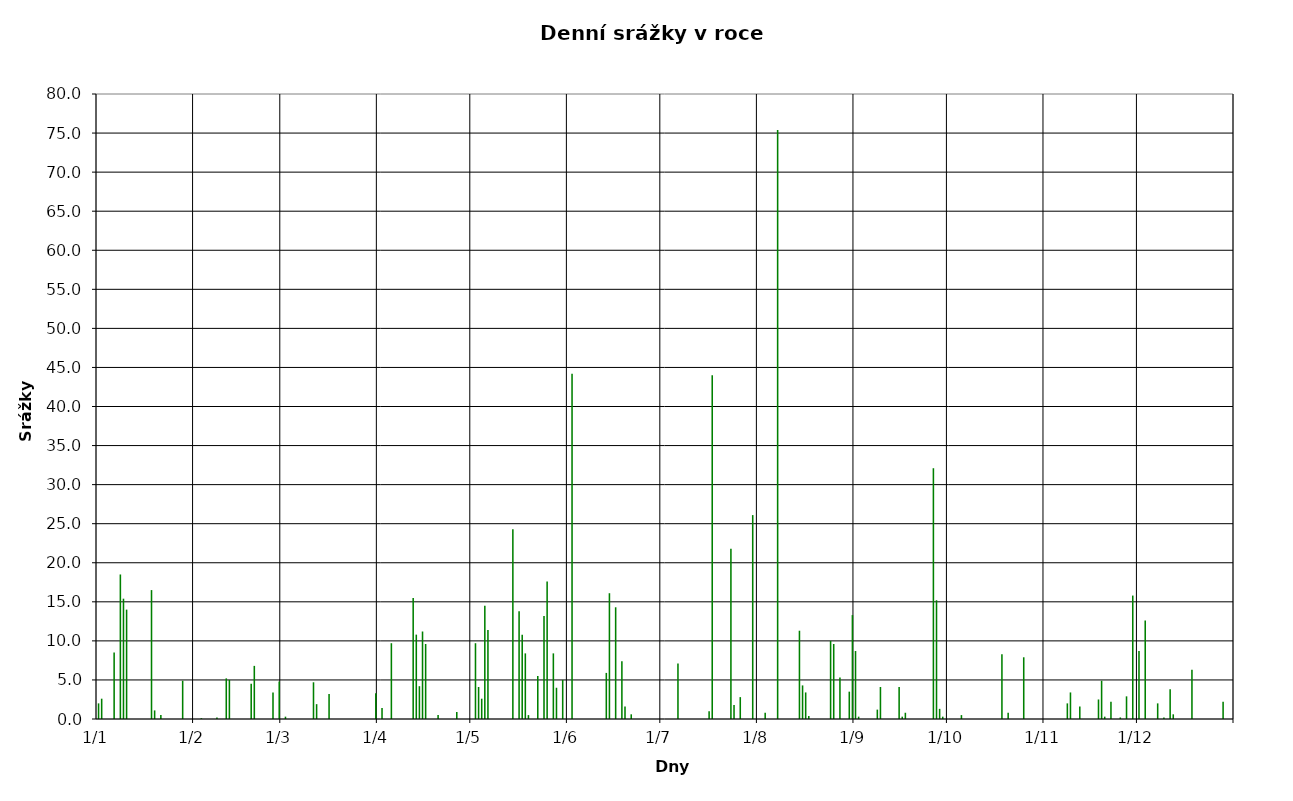
| Category | Series 0 |
|---|---|
| 2010-01-01 | 2 |
| 2010-01-02 | 2.6 |
| 2010-01-03 | 0 |
| 2010-01-04 | 0 |
| 2010-01-05 | 0 |
| 2010-01-06 | 8.5 |
| 2010-01-07 | 0 |
| 2010-01-08 | 18.5 |
| 2010-01-09 | 15.4 |
| 2010-01-10 | 14 |
| 2010-01-11 | 0 |
| 2010-01-12 | 0 |
| 2010-01-13 | 0 |
| 2010-01-14 | 0 |
| 2010-01-15 | 0 |
| 2010-01-16 | 0 |
| 2010-01-17 | 0 |
| 2010-01-18 | 16.5 |
| 2010-01-19 | 1.1 |
| 2010-01-20 | 0 |
| 2010-01-21 | 0.5 |
| 2010-01-22 | 0 |
| 2010-01-23 | 0 |
| 2010-01-24 | 0 |
| 2010-01-25 | 0 |
| 2010-01-26 | 0 |
| 2010-01-27 | 0 |
| 2010-01-28 | 4.9 |
| 2010-01-29 | 0 |
| 2010-01-30 | 0 |
| 2010-01-31 | 0 |
| 2010-02-01 | 0 |
| 2010-02-02 | 0 |
| 2010-02-03 | 0.1 |
| 2010-02-04 | 0 |
| 2010-02-05 | 0 |
| 2010-02-06 | 0 |
| 2010-02-07 | 0 |
| 2010-02-08 | 0.2 |
| 2010-02-09 | 0 |
| 2010-02-10 | 0 |
| 2010-02-11 | 5.2 |
| 2010-02-12 | 5 |
| 2010-02-13 | 0 |
| 2010-02-14 | 0 |
| 2010-02-15 | 0 |
| 2010-02-16 | 0 |
| 2010-02-17 | 0 |
| 2010-02-18 | 0 |
| 2010-02-19 | 4.5 |
| 2010-02-20 | 6.8 |
| 2010-02-21 | 0 |
| 2010-02-22 | 0 |
| 2010-02-23 | 0 |
| 2010-02-24 | 0 |
| 2010-02-25 | 0 |
| 2010-02-26 | 3.4 |
| 2010-02-27 | 0 |
| 2010-02-28 | 4.8 |
| 2010-03-01 | 0 |
| 2010-03-02 | 0.3 |
| 2010-03-03 | 0 |
| 2010-03-04 | 0 |
| 2010-03-05 | 0 |
| 2010-03-06 | 0 |
| 2010-03-07 | 0 |
| 2010-03-08 | 0 |
| 2010-03-09 | 0 |
| 2010-03-10 | 0 |
| 2010-03-11 | 4.7 |
| 2010-03-12 | 1.9 |
| 2010-03-13 | 0 |
| 2010-03-14 | 0 |
| 2010-03-15 | 0 |
| 2010-03-16 | 3.2 |
| 2010-03-17 | 0 |
| 2010-03-18 | 0 |
| 2010-03-19 | 0 |
| 2010-03-20 | 0 |
| 2010-03-21 | 0 |
| 2010-03-22 | 0 |
| 2010-03-23 | 0 |
| 2010-03-24 | 0 |
| 2010-03-25 | 0 |
| 2010-03-26 | 0 |
| 2010-03-27 | 0 |
| 2010-03-28 | 0 |
| 2010-03-29 | 0 |
| 2010-03-30 | 0 |
| 2010-03-31 | 3.3 |
| 2010-04-01 | 0 |
| 2010-04-02 | 1.4 |
| 2010-04-03 | 0 |
| 2010-04-04 | 0 |
| 2010-04-05 | 9.7 |
| 2010-04-06 | 0 |
| 2010-04-07 | 0 |
| 2010-04-08 | 0 |
| 2010-04-09 | 0 |
| 2010-04-10 | 0 |
| 2010-04-11 | 0 |
| 2010-04-12 | 15.5 |
| 2010-04-13 | 10.8 |
| 2010-04-14 | 4.2 |
| 2010-04-15 | 11.2 |
| 2010-04-16 | 9.6 |
| 2010-04-17 | 0 |
| 2010-04-18 | 0 |
| 2010-04-19 | 0 |
| 2010-04-20 | 0.5 |
| 2010-04-21 | 0 |
| 2010-04-22 | 0 |
| 2010-04-23 | 0 |
| 2010-04-24 | 0 |
| 2010-04-25 | 0 |
| 2010-04-26 | 0.9 |
| 2010-04-27 | 0 |
| 2010-04-28 | 0 |
| 2010-04-29 | 0 |
| 2010-04-30 | 0 |
| 2010-05-01 | 0 |
| 2010-05-02 | 9.7 |
| 2010-05-03 | 4.1 |
| 2010-05-04 | 2.6 |
| 2010-05-05 | 14.5 |
| 2010-05-06 | 11.4 |
| 2010-05-07 | 0 |
| 2010-05-08 | 0 |
| 2010-05-09 | 0 |
| 2010-05-10 | 0 |
| 2010-05-11 | 0 |
| 2010-05-12 | 0 |
| 2010-05-13 | 0 |
| 2010-05-14 | 24.3 |
| 2010-05-15 | 0 |
| 2010-05-16 | 13.8 |
| 2010-05-17 | 10.8 |
| 2010-05-18 | 8.4 |
| 2010-05-19 | 0.5 |
| 2010-05-20 | 0 |
| 2010-05-21 | 0 |
| 2010-05-22 | 5.5 |
| 2010-05-23 | 0 |
| 2010-05-24 | 13.2 |
| 2010-05-25 | 17.6 |
| 2010-05-26 | 0 |
| 2010-05-27 | 8.4 |
| 2010-05-28 | 4 |
| 2010-05-29 | 0 |
| 2010-05-30 | 5 |
| 2010-05-31 | 0 |
| 2010-06-01 | 0 |
| 2010-06-02 | 44.2 |
| 2010-06-03 | 0 |
| 2010-06-04 | 0 |
| 2010-06-05 | 0 |
| 2010-06-06 | 0 |
| 2010-06-07 | 0 |
| 2010-06-08 | 0 |
| 2010-06-09 | 0 |
| 2010-06-10 | 0 |
| 2010-06-11 | 0 |
| 2010-06-12 | 0 |
| 2010-06-13 | 5.9 |
| 2010-06-14 | 16.1 |
| 2010-06-15 | 0 |
| 2010-06-16 | 14.3 |
| 2010-06-17 | 0 |
| 2010-06-18 | 7.4 |
| 2010-06-19 | 1.6 |
| 2010-06-20 | 0 |
| 2010-06-21 | 0.6 |
| 2010-06-22 | 0 |
| 2010-06-23 | 0 |
| 2010-06-24 | 0 |
| 2010-06-25 | 0 |
| 2010-06-26 | 0 |
| 2010-06-27 | 0 |
| 2010-06-28 | 0 |
| 2010-06-29 | 0 |
| 2010-06-30 | 0 |
| 2010-07-01 | 0 |
| 2010-07-02 | 0 |
| 2010-07-03 | 0 |
| 2010-07-04 | 0 |
| 2010-07-05 | 0 |
| 2010-07-06 | 7.1 |
| 2010-07-07 | 0 |
| 2010-07-08 | 0 |
| 2010-07-09 | 0 |
| 2010-07-10 | 0 |
| 2010-07-11 | 0 |
| 2010-07-12 | 0 |
| 2010-07-13 | 0 |
| 2010-07-14 | 0 |
| 2010-07-15 | 0 |
| 2010-07-16 | 1 |
| 2010-07-17 | 44 |
| 2010-07-18 | 0 |
| 2010-07-19 | 0 |
| 2010-07-20 | 0 |
| 2010-07-21 | 0 |
| 2010-07-22 | 0 |
| 2010-07-23 | 21.8 |
| 2010-07-24 | 1.8 |
| 2010-07-25 | 0 |
| 2010-07-26 | 2.8 |
| 2010-07-27 | 0 |
| 2010-07-28 | 0 |
| 2010-07-29 | 0 |
| 2010-07-30 | 26.1 |
| 2010-07-31 | 0 |
| 2010-08-01 | 0 |
| 2010-08-02 | 0 |
| 2010-08-03 | 0.8 |
| 2010-08-04 | 0 |
| 2010-08-05 | 0 |
| 2010-08-06 | 0 |
| 2010-08-07 | 75.4 |
| 2010-08-08 | 0 |
| 2010-08-09 | 0 |
| 2010-08-10 | 0 |
| 2010-08-11 | 0 |
| 2010-08-12 | 0 |
| 2010-08-13 | 0 |
| 2010-08-14 | 11.3 |
| 2010-08-15 | 4.3 |
| 2010-08-16 | 3.4 |
| 2010-08-17 | 0.4 |
| 2010-08-18 | 0 |
| 2010-08-19 | 0 |
| 2010-08-20 | 0 |
| 2010-08-21 | 0 |
| 2010-08-22 | 0 |
| 2010-08-23 | 0 |
| 2010-08-24 | 10 |
| 2010-08-25 | 9.6 |
| 2010-08-26 | 0 |
| 2010-08-27 | 5.3 |
| 2010-08-28 | 0 |
| 2010-08-29 | 0 |
| 2010-08-30 | 3.5 |
| 2010-08-31 | 13.3 |
| 2010-09-01 | 8.7 |
| 2010-09-02 | 0.3 |
| 2010-09-03 | 0 |
| 2010-09-04 | 0 |
| 2010-09-05 | 0 |
| 2010-09-06 | 0 |
| 2010-09-07 | 0 |
| 2010-09-08 | 1.2 |
| 2010-09-09 | 4.1 |
| 2010-09-10 | 0 |
| 2010-09-11 | 0 |
| 2010-09-12 | 0 |
| 2010-09-13 | 0 |
| 2010-09-14 | 0 |
| 2010-09-15 | 4.1 |
| 2010-09-16 | 0.3 |
| 2010-09-17 | 0.8 |
| 2010-09-18 | 0 |
| 2010-09-19 | 0 |
| 2010-09-20 | 0 |
| 2010-09-21 | 0 |
| 2010-09-22 | 0 |
| 2010-09-23 | 0 |
| 2010-09-24 | 0 |
| 2010-09-25 | 0 |
| 2010-09-26 | 32.1 |
| 2010-09-27 | 15.2 |
| 2010-09-28 | 1.3 |
| 2010-09-29 | 0.3 |
| 2010-09-30 | 0 |
| 2010-10-01 | 0 |
| 2010-10-02 | 0 |
| 2010-10-03 | 0 |
| 2010-10-04 | 0 |
| 2010-10-05 | 0.5 |
| 2010-10-06 | 0 |
| 2010-10-07 | 0 |
| 2010-10-08 | 0 |
| 2010-10-09 | 0 |
| 2010-10-10 | 0 |
| 2010-10-11 | 0 |
| 2010-10-12 | 0 |
| 2010-10-13 | 0 |
| 2010-10-14 | 0 |
| 2010-10-15 | 0 |
| 2010-10-16 | 0 |
| 2010-10-17 | 0 |
| 2010-10-18 | 8.3 |
| 2010-10-19 | 0 |
| 2010-10-20 | 0.8 |
| 2010-10-21 | 0 |
| 2010-10-22 | 0 |
| 2010-10-23 | 0 |
| 2010-10-24 | 0 |
| 2010-10-25 | 7.9 |
| 2010-10-26 | 0 |
| 2010-10-27 | 0 |
| 2010-10-28 | 0 |
| 2010-10-29 | 0 |
| 2010-10-30 | 0 |
| 2010-10-31 | 0 |
| 2010-11-01 | 0 |
| 2010-11-02 | 0 |
| 2010-11-03 | 0 |
| 2010-11-04 | 0 |
| 2010-11-05 | 0 |
| 2010-11-06 | 0 |
| 2010-11-07 | 0 |
| 2010-11-08 | 2 |
| 2010-11-09 | 3.4 |
| 2010-11-10 | 0 |
| 2010-11-11 | 0 |
| 2010-11-12 | 1.6 |
| 2010-11-13 | 0 |
| 2010-11-14 | 0 |
| 2010-11-15 | 0 |
| 2010-11-16 | 0 |
| 2010-11-17 | 0 |
| 2010-11-18 | 2.5 |
| 2010-11-19 | 4.9 |
| 2010-11-20 | 0.3 |
| 2010-11-21 | 0 |
| 2010-11-22 | 2.2 |
| 2010-11-23 | 0 |
| 2010-11-24 | 0 |
| 2010-11-25 | 0.2 |
| 2010-11-26 | 0 |
| 2010-11-27 | 2.9 |
| 2010-11-28 | 0 |
| 2010-11-29 | 15.8 |
| 2010-11-30 | 0 |
| 2010-12-01 | 8.7 |
| 2010-12-02 | 0 |
| 2010-12-03 | 12.6 |
| 2010-12-04 | 0 |
| 2010-12-05 | 0 |
| 2010-12-06 | 0 |
| 2010-12-07 | 2 |
| 2010-12-08 | 0 |
| 2010-12-09 | 0.2 |
| 2010-12-10 | 0 |
| 2010-12-11 | 3.8 |
| 2010-12-12 | 0.6 |
| 2010-12-13 | 0 |
| 2010-12-14 | 0 |
| 2010-12-15 | 0 |
| 2010-12-16 | 0 |
| 2010-12-17 | 0 |
| 2010-12-18 | 6.3 |
| 2010-12-19 | 0 |
| 2010-12-20 | 0 |
| 2010-12-21 | 0 |
| 2010-12-22 | 0 |
| 2010-12-23 | 0 |
| 2010-12-24 | 0 |
| 2010-12-25 | 0 |
| 2010-12-26 | 0 |
| 2010-12-27 | 0 |
| 2010-12-28 | 2.2 |
| 2010-12-29 | 0 |
| 2010-12-30 | 0 |
| 2010-12-31 | 0 |